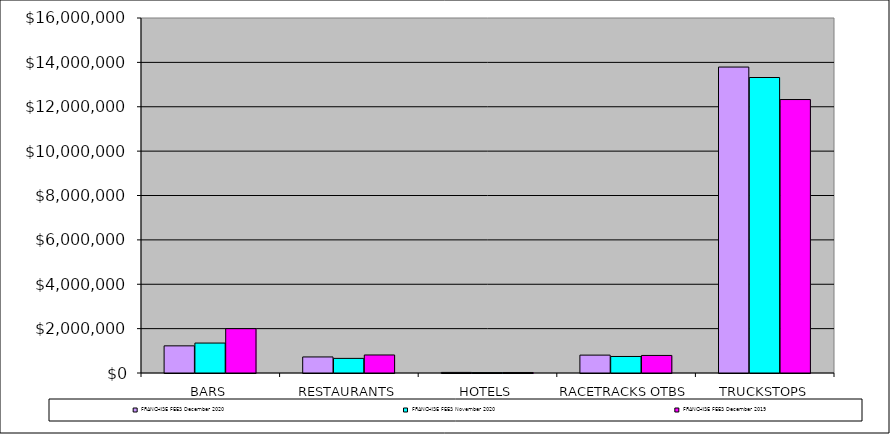
| Category | FRANCHISE FEES |
|---|---|
| BARS | 1998506 |
| RESTAURANTS | 812404 |
| HOTELS | 22793 |
| RACETRACKS OTBS | 791512 |
| TRUCKSTOPS | 12325196 |